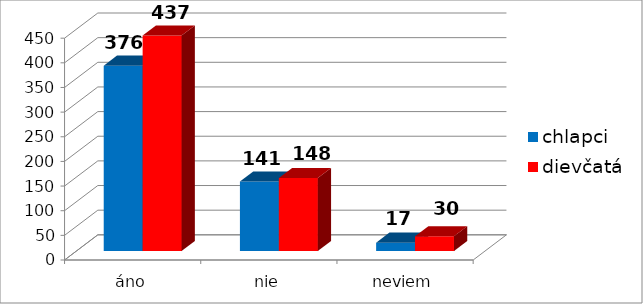
| Category | chlapci | dievčatá |
|---|---|---|
| áno | 376 | 437 |
| nie | 141 | 148 |
| neviem | 17 | 30 |